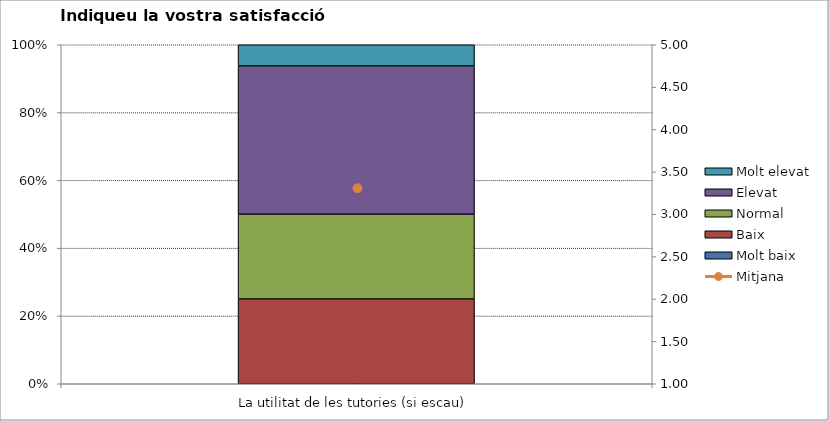
| Category | Molt baix | Baix | Normal  | Elevat | Molt elevat |
|---|---|---|---|---|---|
| La utilitat de les tutories (si escau) | 0 | 4 | 4 | 7 | 1 |